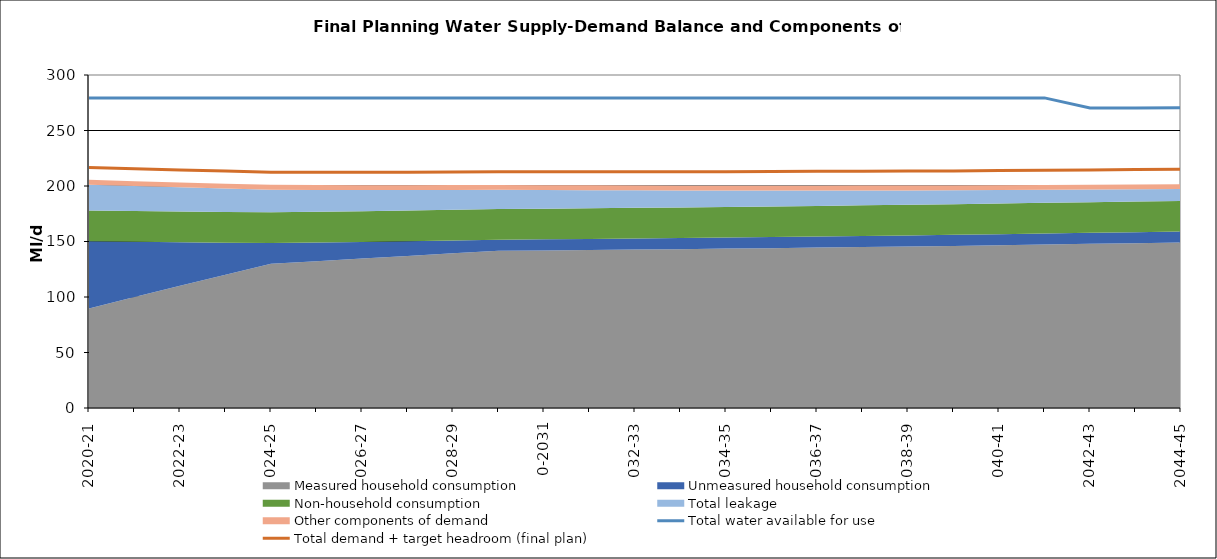
| Category | Total water available for use | Total demand + target headroom (final plan) |
|---|---|---|
| 0 | 279.234 | 216.677 |
| 1 | 279.234 | 215.475 |
| 2 | 279.244 | 214.452 |
| 3 | 279.244 | 213.468 |
| 4 | 279.254 | 212.397 |
| 5 | 279.264 | 212.411 |
| 6 | 279.264 | 212.427 |
| 7 | 279.274 | 212.414 |
| 8 | 279.284 | 212.705 |
| 9 | 279.284 | 212.736 |
| 10 | 279.294 | 212.85 |
| 11 | 279.304 | 212.878 |
| 12 | 279.304 | 212.802 |
| 13 | 279.314 | 212.866 |
| 14 | 279.314 | 212.774 |
| 15 | 279.324 | 213.065 |
| 16 | 279.334 | 213.217 |
| 17 | 279.334 | 213.326 |
| 18 | 279.344 | 213.461 |
| 19 | 279.354 | 213.62 |
| 20 | 279.354 | 213.918 |
| 21 | 279.364 | 214.225 |
| 22 | 270.374 | 214.522 |
| 23 | 270.374 | 214.805 |
| 24 | 270.384 | 215.077 |